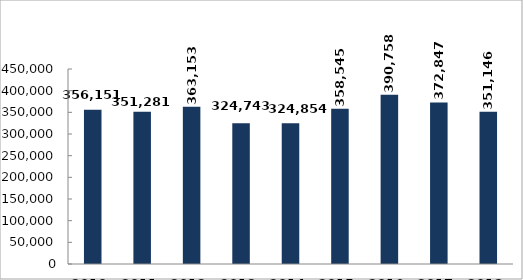
| Category | Közterületi szolgálati óraszám (óra) |
|---|---|
| 2010. év | 356151 |
| 2011. év | 351281 |
| 2012. év | 363153 |
| 2013. év | 324743 |
| 2014. év | 324854 |
| 2015. év | 358545 |
| 2016. év | 390758 |
| 2017. év | 372847 |
| 2018. év | 351146 |